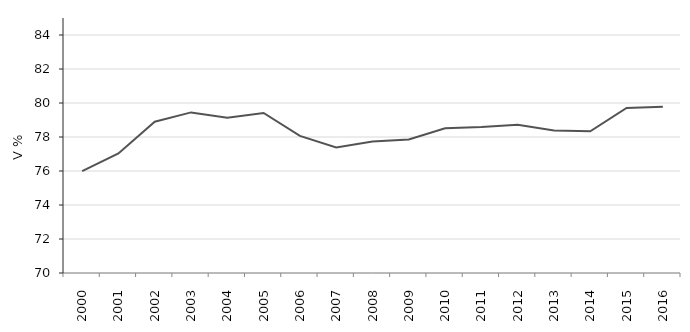
| Category | 15-19 let |
|---|---|
| 2000 | 75.991 |
| 2001 | 77.029 |
| 2002 | 78.898 |
| 2003 | 79.447 |
| 2004 | 79.132 |
| 2005 | 79.416 |
| 2006 | 78.063 |
| 2007 | 77.382 |
| 2008 | 77.742 |
| 2009 | 77.854 |
| 2010 | 78.508 |
| 2011 | 78.589 |
| 2012 | 78.721 |
| 2013 | 78.384 |
| 2014 | 78.336 |
| 2015 | 79.709 |
| 2016 | 79.774 |